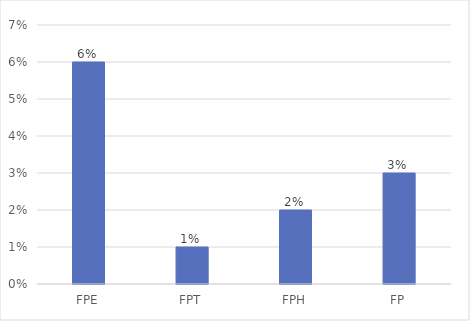
| Category | A changé de lieu de travail |
|---|---|
| FPE | 0.06 |
| FPT | 0.01 |
| FPH | 0.02 |
| FP | 0.03 |